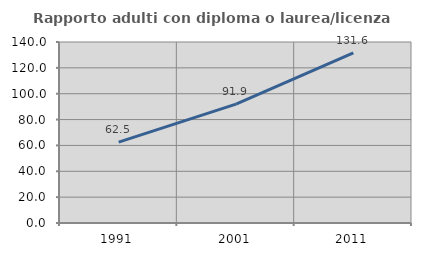
| Category | Rapporto adulti con diploma o laurea/licenza media  |
|---|---|
| 1991.0 | 62.5 |
| 2001.0 | 91.892 |
| 2011.0 | 131.646 |